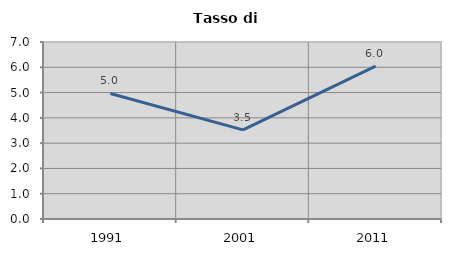
| Category | Tasso di disoccupazione   |
|---|---|
| 1991.0 | 4.966 |
| 2001.0 | 3.524 |
| 2011.0 | 6.047 |